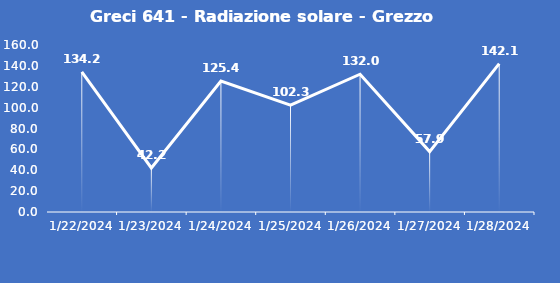
| Category | Greci 641 - Radiazione solare - Grezzo (W/m2) |
|---|---|
| 1/22/24 | 134.2 |
| 1/23/24 | 42.2 |
| 1/24/24 | 125.4 |
| 1/25/24 | 102.3 |
| 1/26/24 | 132 |
| 1/27/24 | 57.9 |
| 1/28/24 | 142.1 |